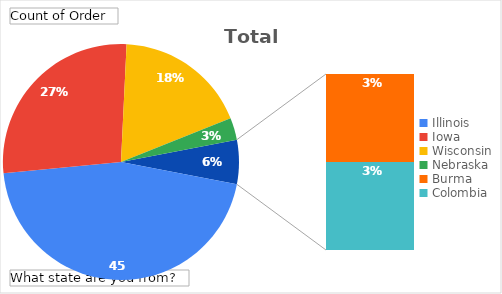
| Category | Total |
|---|---|
| Illinois | 15 |
| Iowa | 9 |
| Wisconsin | 6 |
| Nebraska | 1 |
| Burma | 1 |
| Colombia  | 1 |